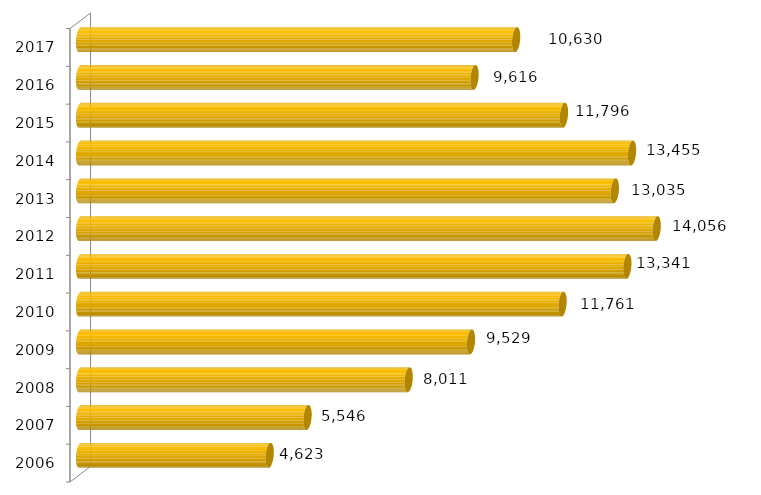
| Category | Inscritos |
|---|---|
| 2006.0 | 4623 |
| 2007.0 | 5546 |
| 2008.0 | 8011 |
| 2009.0 | 9529 |
| 2010.0 | 11761 |
| 2011.0 | 13341 |
| 2012.0 | 14056 |
| 2013.0 | 13035 |
| 2014.0 | 13455 |
| 2015.0 | 11796 |
| 2016.0 | 9616 |
| 2017.0 | 10630 |